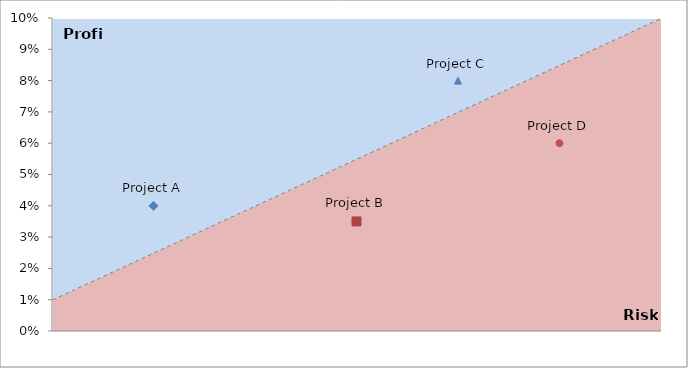
| Category | Line |
|---|---|
| 0 | 0.01 |
| 1 | 0.04 |
| 2 | 0.07 |
| 3 | 0.1 |